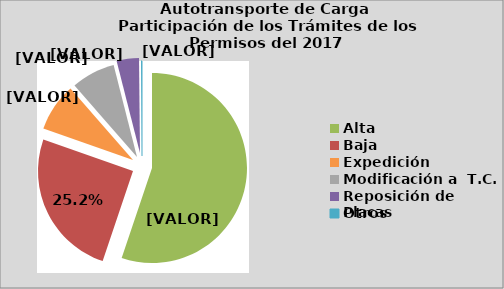
| Category | Series 0 |
|---|---|
| Alta                                         | 55.139 |
| Baja | 25.177 |
| Expedición | 8.2 |
| Modificación a  T.C. | 7.468 |
| Reposición de Placas | 3.792 |
| Otros | 0.164 |